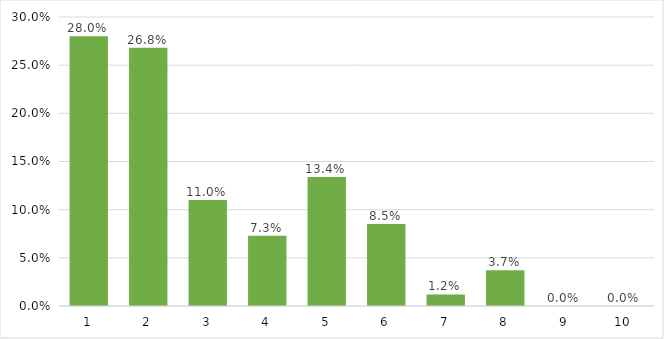
| Category | Series 0 |
|---|---|
| 1.0 | 0.28 |
| 2.0 | 0.268 |
| 3.0 | 0.11 |
| 4.0 | 0.073 |
| 5.0 | 0.134 |
| 6.0 | 0.085 |
| 7.0 | 0.012 |
| 8.0 | 0.037 |
| 9.0 | 0 |
| 10.0 | 0 |